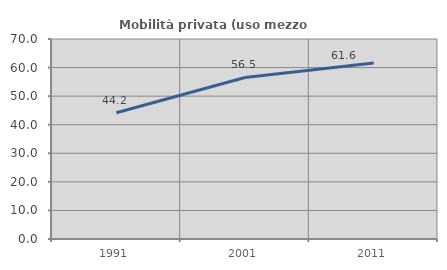
| Category | Mobilità privata (uso mezzo privato) |
|---|---|
| 1991.0 | 44.166 |
| 2001.0 | 56.541 |
| 2011.0 | 61.615 |